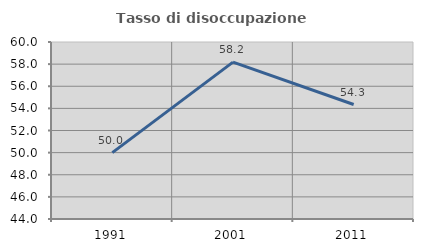
| Category | Tasso di disoccupazione giovanile  |
|---|---|
| 1991.0 | 50 |
| 2001.0 | 58.182 |
| 2011.0 | 54.348 |